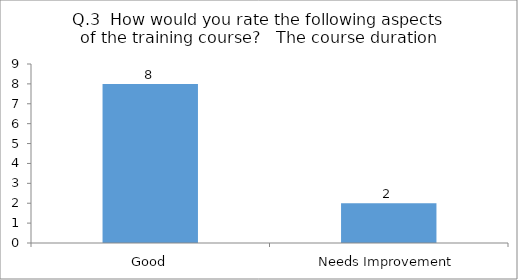
| Category | Q.3  How would you rate the following aspects of the training course?  |
|---|---|
| Good | 8 |
| Needs Improvement | 2 |